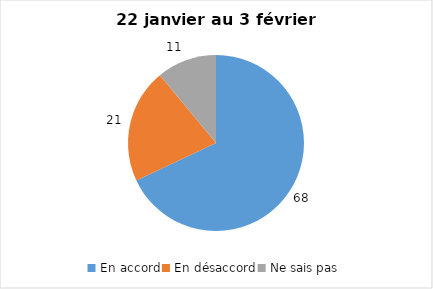
| Category | Series 0 |
|---|---|
| En accord | 68 |
| En désaccord | 21 |
| Ne sais pas | 11 |